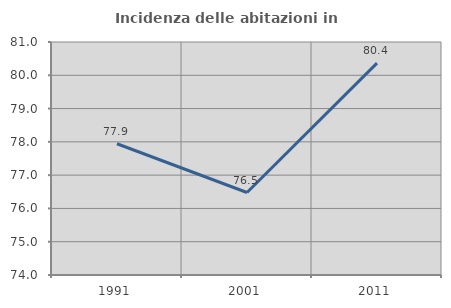
| Category | Incidenza delle abitazioni in proprietà  |
|---|---|
| 1991.0 | 77.944 |
| 2001.0 | 76.478 |
| 2011.0 | 80.364 |